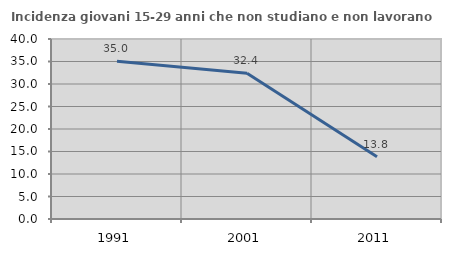
| Category | Incidenza giovani 15-29 anni che non studiano e non lavorano  |
|---|---|
| 1991.0 | 35.032 |
| 2001.0 | 32.414 |
| 2011.0 | 13.846 |